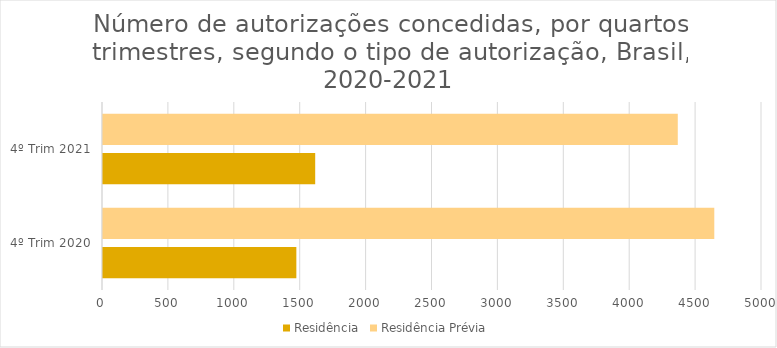
| Category | Residência | Residência Prévia |
|---|---|---|
| 4º Trim 2020 | 1467 | 4638 |
| 4º Trim 2021 | 1610 | 4361 |